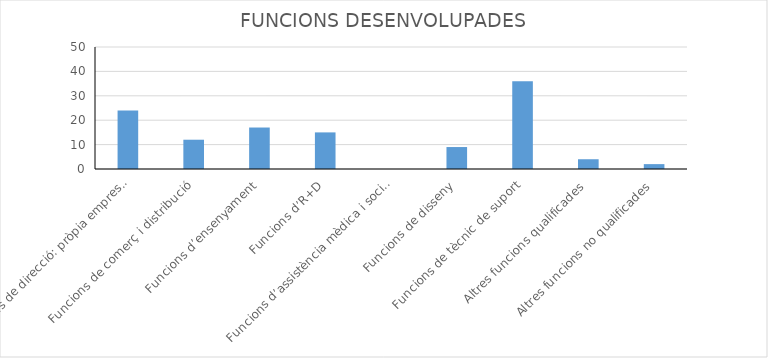
| Category | Series 0 |
|---|---|
| Funcions de direcció: pròpia empresa, direcció, producció, financera, etc. | 24 |
| Funcions de comerç i distribució | 12 |
| Funcions d’ensenyament | 17 |
| Funcions d’R+D | 15 |
| Funcions d’assistència mèdica i social | 0 |
| Funcions de disseny | 9 |
| Funcions de tècnic de suport | 36 |
| Altres funcions qualificades | 4 |
| Altres funcions no qualificades | 2 |